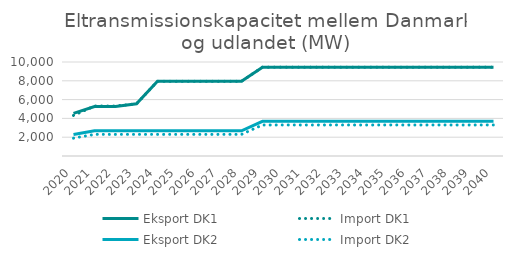
| Category | Eksport DK1 | Import DK1 | Eksport DK2 | Import DK2 |
|---|---|---|---|---|
| 2020.0 | 4537 | 4315 | 2285 | 1900 |
| 2021.0 | 5257 | 5315 | 2685 | 2300 |
| 2022.0 | 5257 | 5315 | 2685 | 2300 |
| 2023.0 | 5547 | 5547 | 2685 | 2300 |
| 2024.0 | 7947 | 7947 | 2685 | 2300 |
| 2025.0 | 7947 | 7947 | 2685 | 2300 |
| 2026.0 | 7947 | 7947 | 2685 | 2300 |
| 2027.0 | 7947 | 7947 | 2685 | 2300 |
| 2028.0 | 7947 | 7947 | 2685 | 2300 |
| 2029.0 | 9447 | 9447 | 3685 | 3300 |
| 2030.0 | 9447 | 9447 | 3685 | 3300 |
| 2031.0 | 9447 | 9447 | 3685 | 3300 |
| 2032.0 | 9447 | 9447 | 3685 | 3300 |
| 2033.0 | 9447 | 9447 | 3685 | 3300 |
| 2034.0 | 9447 | 9447 | 3685 | 3300 |
| 2035.0 | 9447 | 9447 | 3685 | 3300 |
| 2036.0 | 9447 | 9447 | 3685 | 3300 |
| 2037.0 | 9447 | 9447 | 3685 | 3300 |
| 2038.0 | 9447 | 9447 | 3685 | 3300 |
| 2039.0 | 9447 | 9447 | 3685 | 3300 |
| 2040.0 | 9447 | 9447 | 3685 | 3300 |